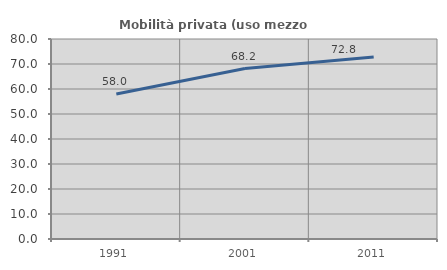
| Category | Mobilità privata (uso mezzo privato) |
|---|---|
| 1991.0 | 57.982 |
| 2001.0 | 68.199 |
| 2011.0 | 72.846 |